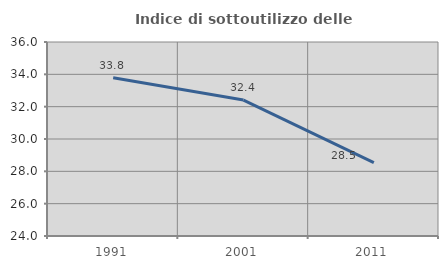
| Category | Indice di sottoutilizzo delle abitazioni  |
|---|---|
| 1991.0 | 33.788 |
| 2001.0 | 32.41 |
| 2011.0 | 28.537 |